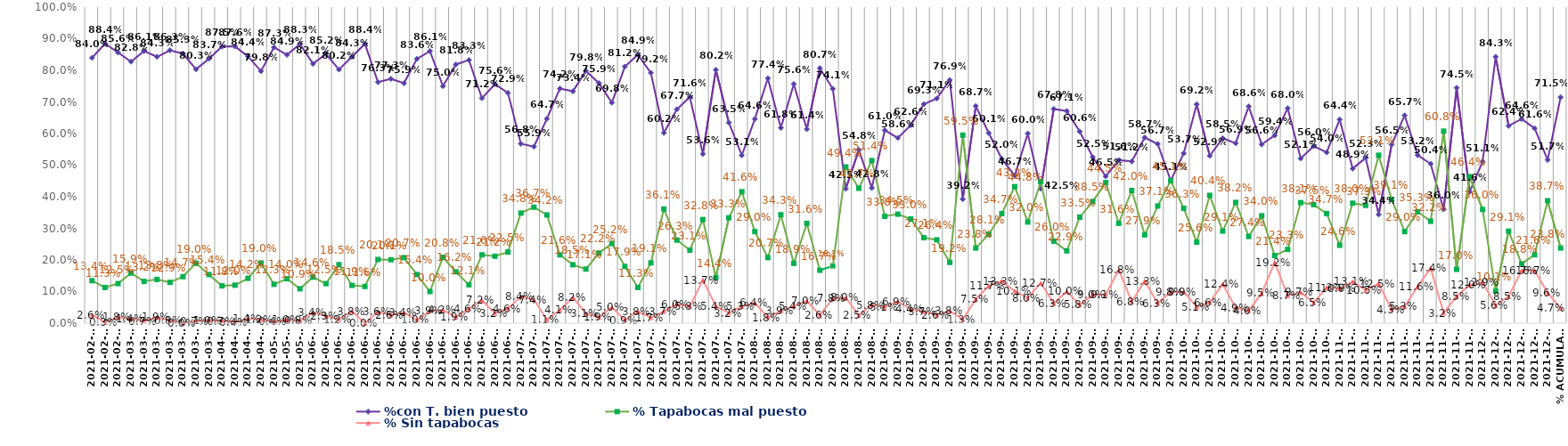
| Category | %con T. bien puesto | % Tapabocas mal puesto | % Sin tapabocas |
|---|---|---|---|
| 2021-02-19 | 0.84 | 0.134 | 0.026 |
| 2021-02-23 | 0.884 | 0.113 | 0.003 |
| 2021-02-25 | 0.856 | 0.125 | 0.018 |
| 2021-03-04 | 0.828 | 0.159 | 0.014 |
| 2021-03-05 | 0.861 | 0.132 | 0.007 |
| 2021-03-10 | 0.843 | 0.138 | 0.019 |
| 2021-03-11 | 0.863 | 0.129 | 0.008 |
| 2021-03-12 | 0.853 | 0.147 | 0 |
| 2021-03-29 | 0.803 | 0.19 | 0.007 |
| 2021-03-30 | 0.837 | 0.154 | 0.01 |
| 2021-04-06 | 0.875 | 0.118 | 0.007 |
| 2021-04-07 | 0.876 | 0.12 | 0.004 |
| 2021-04-15 | 0.844 | 0.142 | 0.014 |
| 2021-04-20 | 0.798 | 0.19 | 0.012 |
| 2021-05-04 | 0.873 | 0.123 | 0.004 |
| 2021-05-07 | 0.849 | 0.14 | 0.01 |
| 2021-05-21 | 0.883 | 0.109 | 0.008 |
| 2021-06-01 | 0.821 | 0.146 | 0.034 |
| 2021-06-04 | 0.852 | 0.125 | 0.023 |
| 2021-06-08 | 0.802 | 0.185 | 0.012 |
| 2021-06-10 | 0.843 | 0.119 | 0.038 |
| 2021-06-11 | 0.884 | 0.116 | 0 |
| 2021-06-12 | 0.763 | 0.201 | 0.036 |
| 2021-06-15 | 0.773 | 0.201 | 0.026 |
| 2021-06-16 | 0.759 | 0.207 | 0.034 |
| 2021-06-18 | 0.836 | 0.154 | 0.01 |
| 2021-06-19 | 0.861 | 0.1 | 0.039 |
| 2021-06-21 | 0.75 | 0.208 | 0.042 |
| 2021-06-22 | 0.818 | 0.162 | 0.019 |
| 2021-06-23 | 0.833 | 0.121 | 0.046 |
| 2021-06-25 | 0.712 | 0.216 | 0.072 |
| 2021-06-26 | 0.756 | 0.212 | 0.032 |
| 2021-06-30 | 0.729 | 0.225 | 0.046 |
| 2021-07-03 | 0.568 | 0.348 | 0.084 |
| 2021-07-06 | 0.559 | 0.367 | 0.074 |
| 2021-07-07 | 0.647 | 0.342 | 0.011 |
| 2021-07-08 | 0.742 | 0.216 | 0.041 |
| 2021-07-09 | 0.734 | 0.185 | 0.082 |
| 2021-07-10 | 0.798 | 0.171 | 0.031 |
| 2021-07-12 | 0.759 | 0.222 | 0.019 |
| 2021-07-13 | 0.698 | 0.252 | 0.05 |
| 2021-07-14 | 0.812 | 0.179 | 0.009 |
| 2021-07-15 | 0.849 | 0.113 | 0.038 |
| 2021-07-16 | 0.792 | 0.191 | 0.017 |
| 2021-07-24 | 0.602 | 0.361 | 0.037 |
| 2021-07-19 | 0.677 | 0.263 | 0.06 |
| 2021-07-21 | 0.716 | 0.231 | 0.053 |
| 2021-07-28 | 0.536 | 0.328 | 0.137 |
| 2021-07-29 | 0.802 | 0.144 | 0.054 |
| 2021-07-30 | 0.635 | 0.333 | 0.032 |
| 2021-07-31 | 0.531 | 0.416 | 0.053 |
| 2021-08-03 | 0.646 | 0.29 | 0.064 |
| 2021-08-04 | 0.774 | 0.207 | 0.018 |
| 2021-08-05 | 0.618 | 0.343 | 0.039 |
| 2021-08-06 | 0.756 | 0.189 | 0.054 |
| 2021-08-17 | 0.614 | 0.316 | 0.07 |
| 2021-08-18 | 0.807 | 0.167 | 0.026 |
| 2021-08-19 | 0.741 | 0.181 | 0.078 |
| 2021-08-20 | 0.425 | 0.494 | 0.08 |
| 2021-08-30 | 0.548 | 0.427 | 0.025 |
| 2021-08-31 | 0.428 | 0.514 | 0.058 |
| 2021-09-01 | 0.61 | 0.338 | 0.051 |
| 2021-09-02 | 0.586 | 0.345 | 0.069 |
| 2021-09-03 | 0.626 | 0.33 | 0.044 |
| 2021-09-04 | 0.693 | 0.271 | 0.037 |
| 2021-09-06 | 0.711 | 0.264 | 0.026 |
| 2021-09-08 | 0.769 | 0.192 | 0.038 |
| 2021-09-10 | 0.392 | 0.595 | 0.013 |
| 2021-09-13 | 0.687 | 0.238 | 0.075 |
| 2021-09-14 | 0.601 | 0.281 | 0.117 |
| 2021-09-15 | 0.52 | 0.347 | 0.133 |
| 2021-09-16 | 0.467 | 0.432 | 0.101 |
| 2021-09-17 | 0.6 | 0.32 | 0.08 |
| 2021-09-18 | 0.425 | 0.448 | 0.127 |
| 2021-09-20 | 0.678 | 0.26 | 0.063 |
| 2021-09-21 | 0.671 | 0.229 | 0.1 |
| 2021-09-22 | 0.606 | 0.335 | 0.058 |
| 2021-09-23 | 0.525 | 0.385 | 0.09 |
| 2021-09-24 | 0.465 | 0.445 | 0.091 |
| 2021-09-25 | 0.516 | 0.316 | 0.168 |
| 2021-09-27 | 0.512 | 0.42 | 0.068 |
| 2021-09-28 | 0.587 | 0.279 | 0.133 |
| 2021-09-29 | 0.567 | 0.371 | 0.062 |
| 2021-09-30 | 0.451 | 0.451 | 0.098 |
| 2021-10-01 | 0.537 | 0.363 | 0.099 |
| 2021-10-05 | 0.692 | 0.256 | 0.051 |
| 2021-10-11 | 0.529 | 0.404 | 0.066 |
| 2021-10-13 | 0.585 | 0.291 | 0.124 |
| 2021-10-14 | 0.569 | 0.382 | 0.049 |
| 2021-10-15 | 0.686 | 0.274 | 0.04 |
| 2021-10-16 | 0.566 | 0.34 | 0.095 |
| 2021-10-19 | 0.594 | 0.214 | 0.192 |
| 2021-10-20 | 0.68 | 0.233 | 0.087 |
| 2021-10-22 | 0.521 | 0.381 | 0.097 |
| 2021-10-26 | 0.56 | 0.375 | 0.065 |
| 2021-10-27 | 0.54 | 0.347 | 0.113 |
| 2021-11-02 | 0.644 | 0.246 | 0.109 |
| 2021-11-03 | 0.489 | 0.38 | 0.131 |
| 2021-11-06 | 0.523 | 0.373 | 0.105 |
| 2021-11-09 | 0.344 | 0.531 | 0.125 |
| 2021-11-10 | 0.565 | 0.391 | 0.043 |
| 2021-11-17 | 0.657 | 0.29 | 0.053 |
| 2021-11-22 | 0.532 | 0.353 | 0.116 |
| 2021-11-24 | 0.504 | 0.322 | 0.174 |
| 2021-11-25 | 0.36 | 0.608 | 0.032 |
| 2021-11-26 | 0.745 | 0.17 | 0.085 |
| 2021-11-29 | 0.416 | 0.464 | 0.12 |
| 2021-12-04 | 0.511 | 0.36 | 0.129 |
| 2021-12-07 | 0.843 | 0.101 | 0.056 |
| 2021-12-09 | 0.624 | 0.291 | 0.085 |
| 2021-12-10 | 0.646 | 0.188 | 0.167 |
| 2021-12-11 | 0.616 | 0.216 | 0.167 |
| 2021-12-13 | 0.517 | 0.387 | 0.096 |
| % Acumulado | 0.715 | 0.238 | 0.047 |